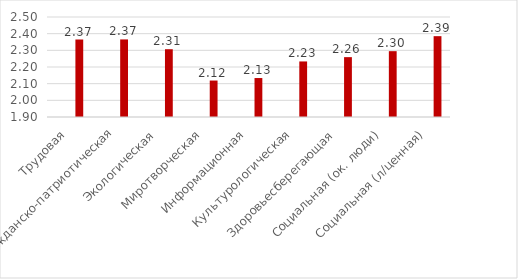
| Category | Series 0 | Series 1 | Series 2 |
|---|---|---|---|
| Трудовая |  |  | 2.365 |
| Гражданско-патриотическая |  |  | 2.365 |
| Экологическая |  |  | 2.307 |
| Миротворческая |  |  | 2.119 |
| Информационная |  |  | 2.134 |
| Культурологическая |  |  | 2.233 |
| Здоровьесберегающая |  |  | 2.259 |
| Социальная (ок. люди) |  |  | 2.295 |
| Социальная (л/ценная) |  |  | 2.385 |